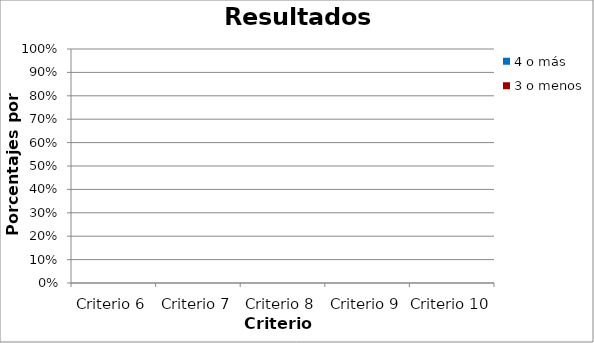
| Category | 4 o más | 3 o menos |
|---|---|---|
| Criterio 6 | 0 | 0 |
| Criterio 7 | 0 | 0 |
| Criterio 8 | 0 | 0 |
| Criterio 9 | 0 | 0 |
| Criterio 10 | 0 | 0 |